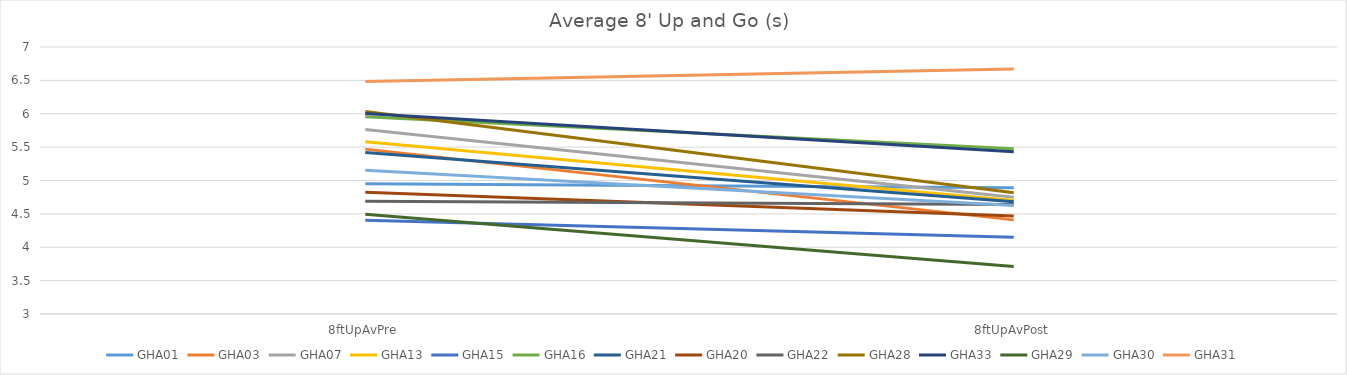
| Category | GHA01 | GHA03 | GHA07 | GHA13 | GHA15 | GHA16 | GHA21 | GHA20 | GHA22 | GHA28 | GHA33 | GHA29 | GHA30 | GHA31 |
|---|---|---|---|---|---|---|---|---|---|---|---|---|---|---|
| 8ftUpAvPre | 4.95 | 5.47 | 5.765 | 5.58 | 4.405 | 5.955 | 5.42 | 4.825 | 4.69 | 6.035 | 6.005 | 4.495 | 5.154 | 6.485 |
| 8ftUpAvPost | 4.89 | 4.41 | 4.75 | 4.7 | 4.15 | 5.475 | 4.68 | 4.47 | 4.64 | 4.815 | 5.43 | 3.71 | 4.625 | 6.67 |